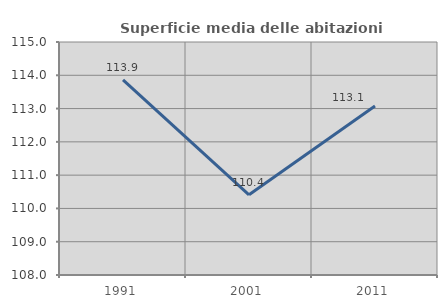
| Category | Superficie media delle abitazioni occupate |
|---|---|
| 1991.0 | 113.86 |
| 2001.0 | 110.408 |
| 2011.0 | 113.079 |